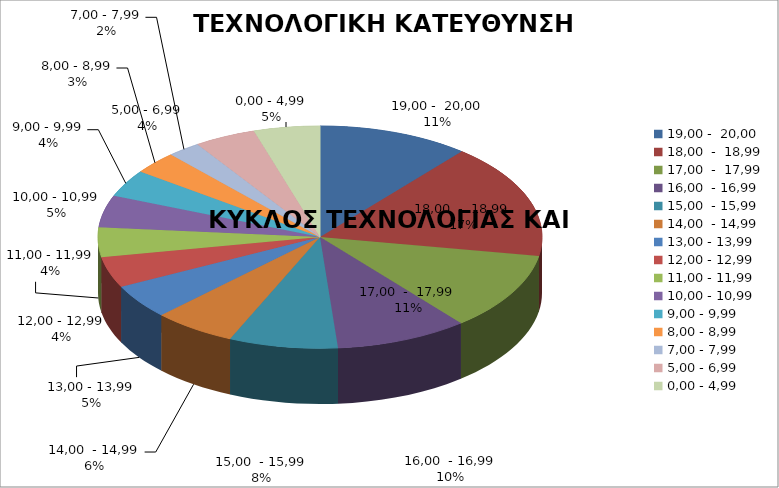
| Category | ΤΕΧΝΟΛΟΓΙΚΗ ΚΑΤΕΥΘΥΝΣΗ - 2010 |
|---|---|
| 19,00 -  20,00 | 11.015 |
| 18,00  -  18,99 | 16.695 |
| 17,00  -  17,99 | 11.36 |
| 16,00  - 16,99 | 9.639 |
| 15,00  - 15,99 | 7.917 |
| 14,00  - 14,99 | 6.024 |
| 13,00 - 13,99 | 4.991 |
| 12,00 - 12,99 | 4.475 |
| 11,00 - 11,99 | 4.303 |
| 10,00 - 10,99 | 4.647 |
| 9,00 - 9,99 | 3.959 |
| 8,00 - 8,99 | 3.27 |
| 7,00 - 7,99 | 2.41 |
| 5,00 - 6,99 | 4.475 |
| 0,00 - 4,99 | 4.819 |